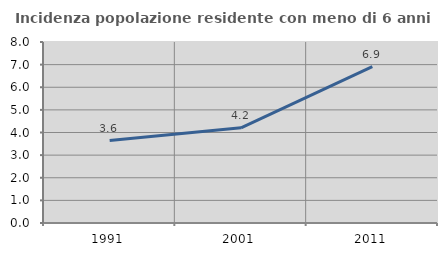
| Category | Incidenza popolazione residente con meno di 6 anni |
|---|---|
| 1991.0 | 3.645 |
| 2001.0 | 4.207 |
| 2011.0 | 6.916 |